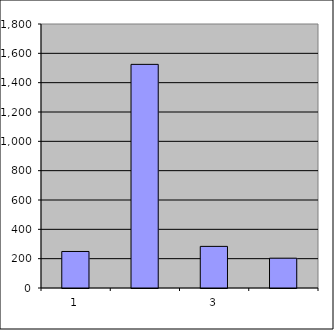
| Category | Series 0 |
|---|---|
| 0 | 249 |
| 1 | 1524.798 |
| 2 | 283.702 |
| 3 | 203.359 |